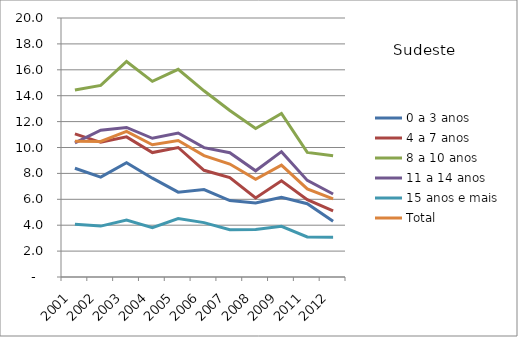
| Category | 0 a 3 anos | 4 a 7 anos | 8 a 10 anos | 11 a 14 anos | 15 anos e mais | Total |
|---|---|---|---|---|---|---|
| 2001.0 | 8.4 | 11.05 | 14.44 | 10.36 | 4.08 | 10.49 |
| 2002.0 | 7.71 | 10.4 | 14.79 | 11.34 | 3.93 | 10.47 |
| 2003.0 | 8.83 | 10.82 | 16.64 | 11.55 | 4.39 | 11.24 |
| 2004.0 | 7.63 | 9.61 | 15.11 | 10.71 | 3.81 | 10.21 |
| 2005.0 | 6.55 | 10 | 16.04 | 11.12 | 4.51 | 10.54 |
| 2006.0 | 6.75 | 8.24 | 14.38 | 9.99 | 4.2 | 9.37 |
| 2007.0 | 5.9 | 7.68 | 12.86 | 9.6 | 3.65 | 8.72 |
| 2008.0 | 5.72 | 6.1 | 11.47 | 8.2 | 3.66 | 7.55 |
| 2009.0 | 6.15 | 7.43 | 12.63 | 9.68 | 3.91 | 8.64 |
| 2011.0 | 5.66 | 5.97 | 9.62 | 7.46 | 3.09 | 6.8 |
| 2012.0 | 4.3 | 5.11 | 9.37 | 6.41 | 3.07 | 6.03 |